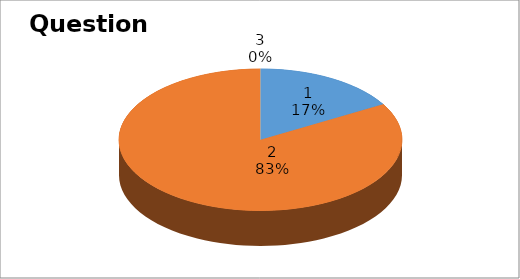
| Category | Series 0 |
|---|---|
| 0 | 1 |
| 1 | 5 |
| 2 | 0 |